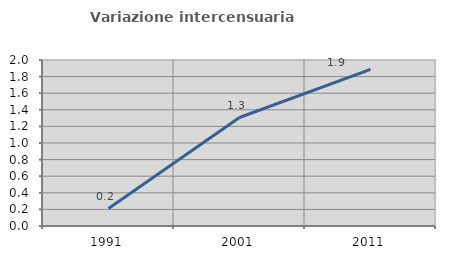
| Category | Variazione intercensuaria annua |
|---|---|
| 1991.0 | 0.21 |
| 2001.0 | 1.307 |
| 2011.0 | 1.886 |